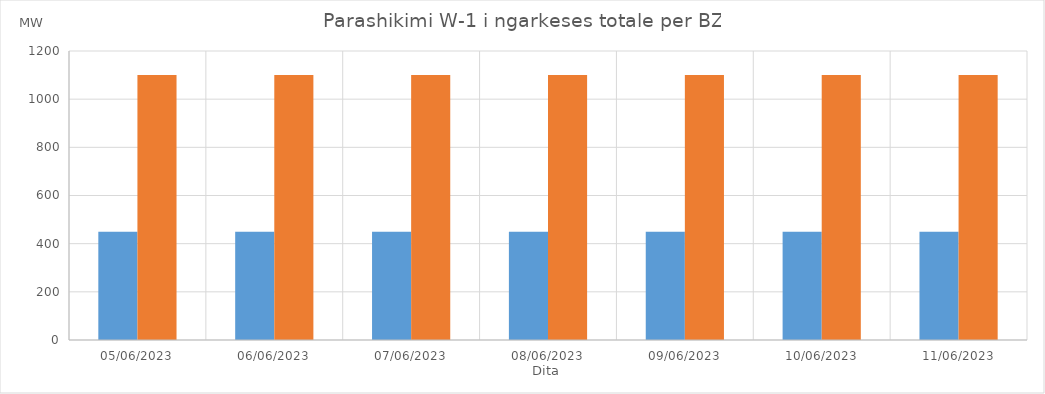
| Category | Min (MW) | Max (MW) |
|---|---|---|
| 05/06/2023 | 450 | 1100 |
| 06/06/2023 | 450 | 1100 |
| 07/06/2023 | 450 | 1100 |
| 08/06/2023 | 450 | 1100 |
| 09/06/2023 | 450 | 1100 |
| 10/06/2023 | 450 | 1100 |
| 11/06/2023 | 450 | 1100 |